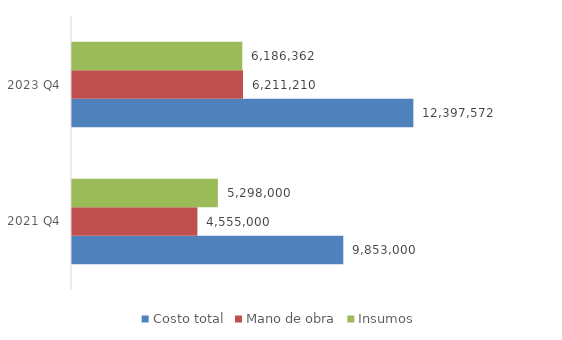
| Category | Costo total | Mano de obra | Insumos |
|---|---|---|---|
| 2021 Q4 | 9853000 | 4555000 | 5298000 |
| 2023 Q4 | 12397571.996 | 6211210 | 6186361.996 |